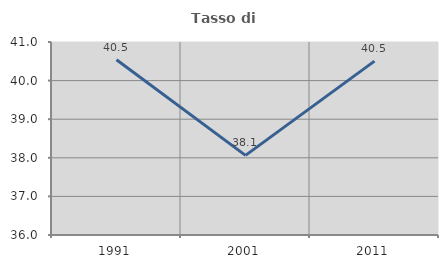
| Category | Tasso di occupazione   |
|---|---|
| 1991.0 | 40.541 |
| 2001.0 | 38.062 |
| 2011.0 | 40.505 |